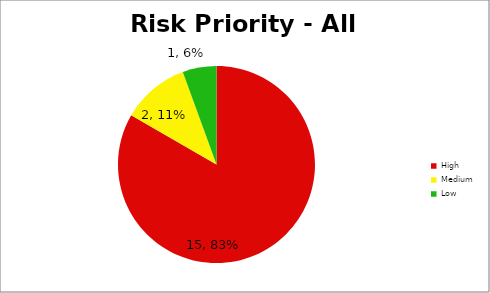
| Category | Count |
|---|---|
| High | 15 |
| Medium | 2 |
| Low | 1 |